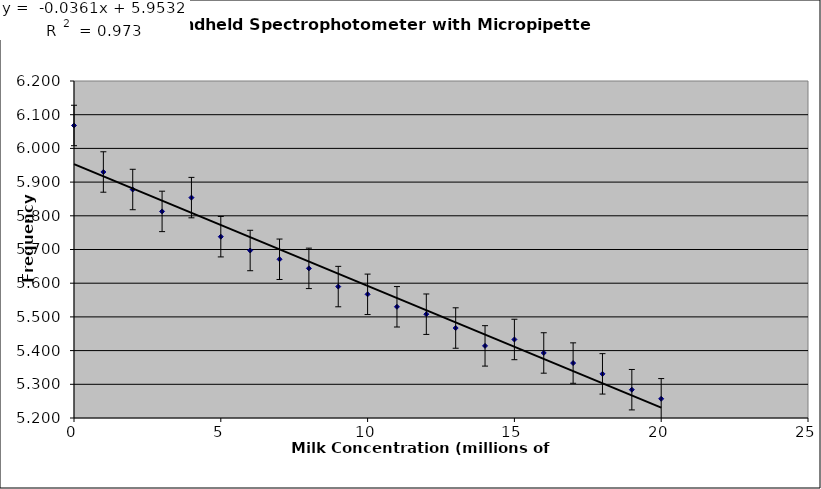
| Category | Series 0 |
|---|---|
| 0.0 | 6.068 |
| 1.0 | 5.93 |
| 2.0 | 5.878 |
| 3.0 | 5.813 |
| 4.0 | 5.854 |
| 5.0 | 5.738 |
| 6.0 | 5.697 |
| 7.0 | 5.671 |
| 8.0 | 5.644 |
| 9.0 | 5.59 |
| 10.0 | 5.567 |
| 11.0 | 5.53 |
| 12.0 | 5.508 |
| 13.0 | 5.467 |
| 14.0 | 5.414 |
| 15.0 | 5.433 |
| 16.0 | 5.393 |
| 17.0 | 5.363 |
| 18.0 | 5.331 |
| 19.0 | 5.284 |
| 20.0 | 5.257 |